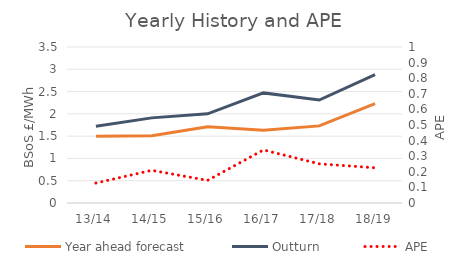
| Category | Year ahead forecast | Outturn |
|---|---|---|
| 13/14 | 1.5 | 1.72 |
| 14/15 | 1.51 | 1.91 |
| 15/16 | 1.71 | 2 |
| 16/17 | 1.63 | 2.47 |
| 17/18 | 1.73 | 2.31 |
| 18/19 | 2.23 | 2.88 |